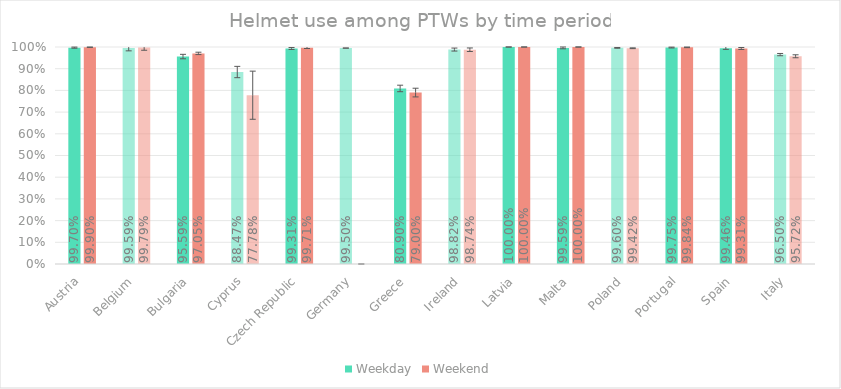
| Category | Weekday | Weekend |
|---|---|---|
| Austria | 0.997 | 0.999 |
| Belgium | 0.996 | 0.998 |
| Bulgaria | 0.956 | 0.971 |
| Cyprus | 0.885 | 0.778 |
| Czech Republic | 0.993 | 0.997 |
| Germany | 0.995 | 0 |
| Greece | 0.809 | 0.79 |
| Ireland | 0.988 | 0.987 |
| Latvia | 1 | 1 |
| Malta | 0.996 | 1 |
| Poland | 0.996 | 0.994 |
| Portugal | 0.998 | 0.998 |
| Spain | 0.995 | 0.993 |
| Italy | 0.965 | 0.957 |